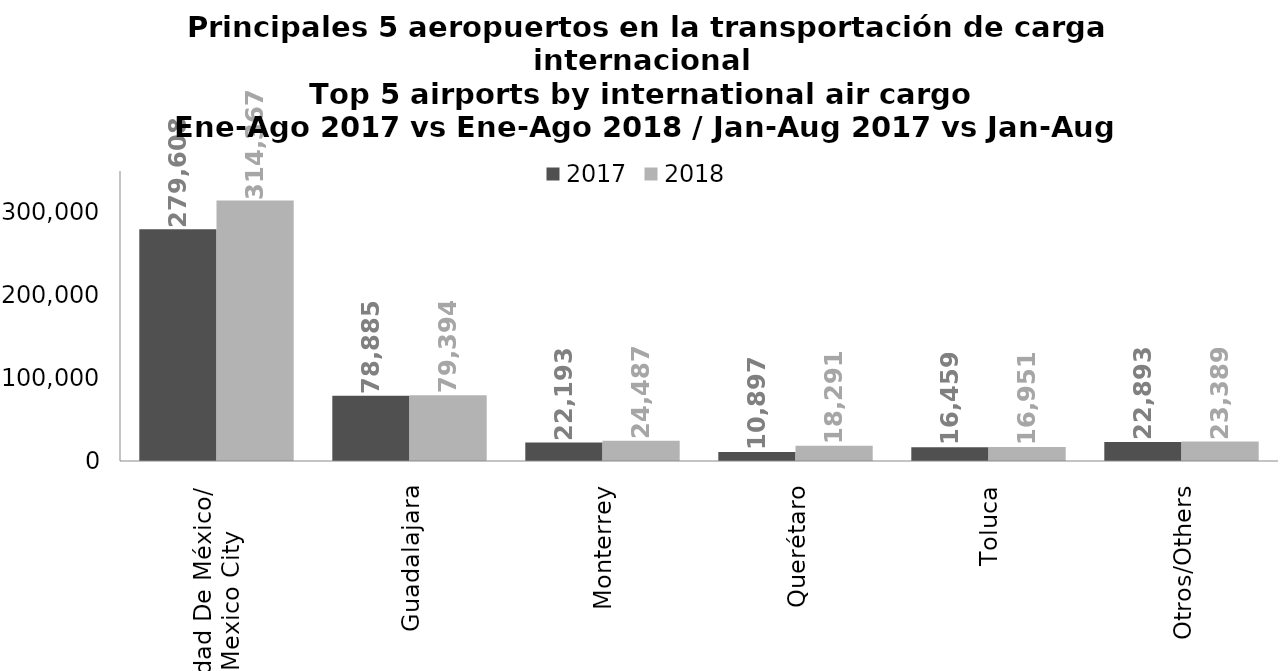
| Category | 2017 | 2018 |
|---|---|---|
| Ciudad De México/
Mexico City | 279608.27 | 314367.12 |
| Guadalajara | 78884.714 | 79393.5 |
| Monterrey | 22193.012 | 24486.841 |
| Querétaro | 10896.738 | 18291.119 |
| Toluca | 16459.365 | 16951.116 |
| Otros/Others | 22893.081 | 23389.397 |